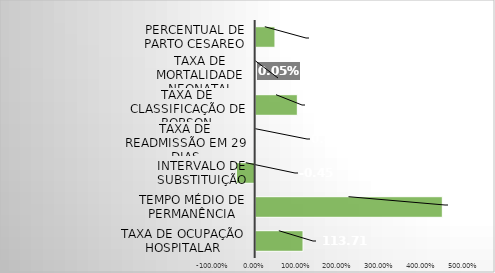
| Category | Series 0 |
|---|---|
| Taxa de Ocupação Hospitalar | 1.137 |
| Tempo Médio de permanência | 4.48 |
| Intervalo de substituição | -0.45 |
| Taxa de readmissão em 29 dias | 0.004 |
| Taxa de classificação de Robson | 1 |
| Taxa de mortalidade neonatal | 0 |
| Percentual de parto cesareo | 0.463 |